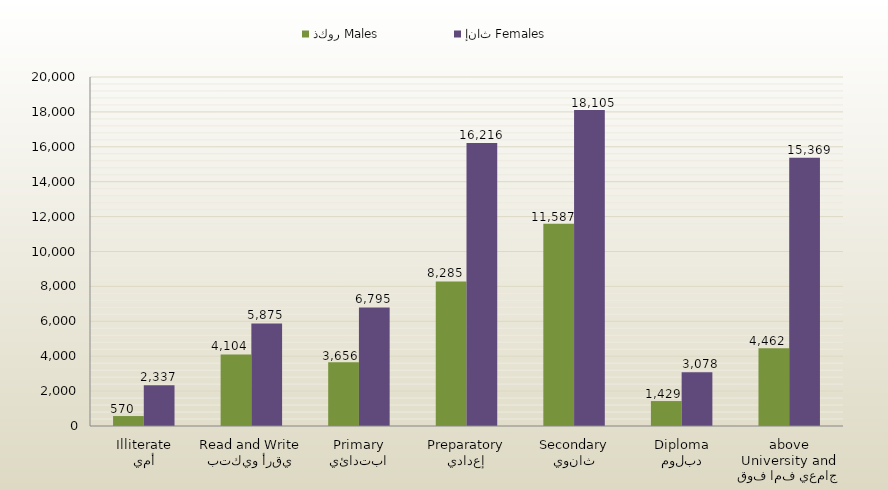
| Category | ذكور Males | إناث Females |
|---|---|---|
| أمي
Illiterate | 570 | 2337 |
| يقرأ ويكتب
Read and Write | 4104 | 5875 |
| ابتدائي
Primary | 3656 | 6795 |
| إعدادي
Preparatory | 8285 | 16216 |
| ثانوي
Secondary | 11587 | 18105 |
| دبلوم
Diploma | 1429 | 3078 |
| جامعي فما فوق
University and above | 4462 | 15369 |